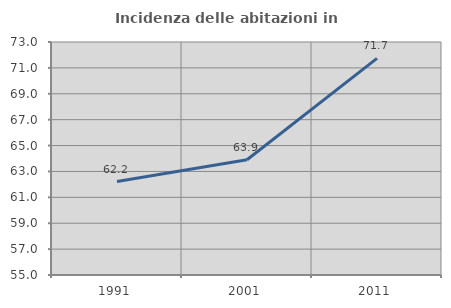
| Category | Incidenza delle abitazioni in proprietà  |
|---|---|
| 1991.0 | 62.222 |
| 2001.0 | 63.902 |
| 2011.0 | 71.739 |